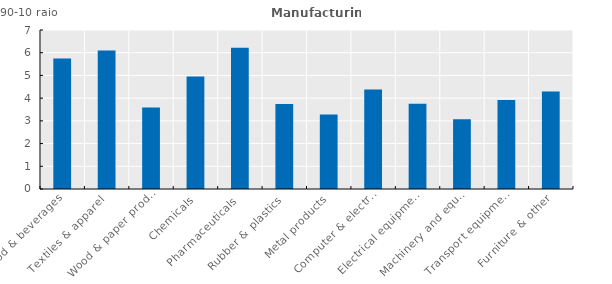
| Category | Series 0 |
|---|---|
| Food & beverages | 5.748 |
| Textiles & apparel  | 6.095 |
| Wood & paper prod.  | 3.592 |
| Chemicals | 4.952 |
| Pharmaceuticals  | 6.223 |
| Rubber & plastics  | 3.739 |
| Metal products | 3.278 |
| Computer & electronics  | 4.375 |
| Electrical equipment | 3.758 |
| Machinery and equipment | 3.066 |
| Transport equipment  | 3.923 |
| Furniture & other | 4.288 |